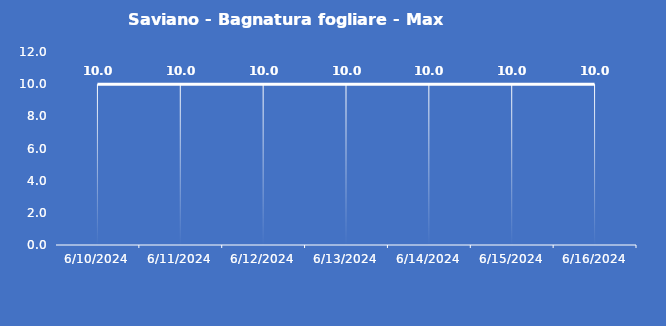
| Category | Saviano - Bagnatura fogliare - Max (min) |
|---|---|
| 6/10/24 | 10 |
| 6/11/24 | 10 |
| 6/12/24 | 10 |
| 6/13/24 | 10 |
| 6/14/24 | 10 |
| 6/15/24 | 10 |
| 6/16/24 | 10 |